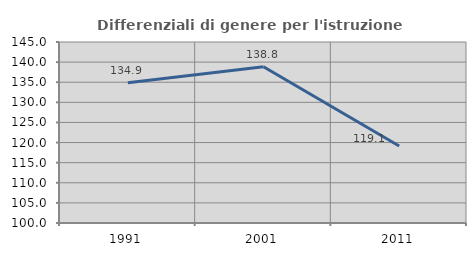
| Category | Differenziali di genere per l'istruzione superiore |
|---|---|
| 1991.0 | 134.892 |
| 2001.0 | 138.834 |
| 2011.0 | 119.145 |